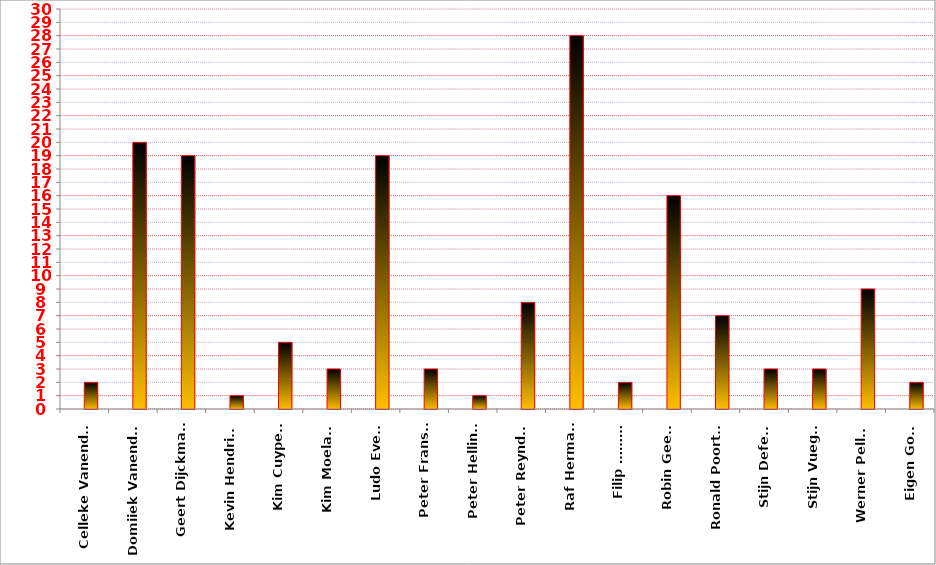
| Category | Series 0 | Series 1 |
|---|---|---|
| Celleke Vanendert |  | 2 |
| Domiiek Vanendert  |  | 20 |
| Geert Dijckmans |  | 19 |
| Kevin Hendrickx |  | 1 |
| Kim Cuypers |  | 5 |
| Kim Moelants |  | 3 |
| Ludo Evens |  | 19 |
| Peter Fransen |  | 3 |
| Peter Hellings |  | 1 |
| Peter Reynders |  | 8 |
| Raf Hermans |  | 28 |
| Filip ……… |  | 2 |
| Robin Geerts |  | 16 |
| Ronald Poorters |  | 7 |
| Stijn Deferm |  | 3 |
| Stijn Vuegen |  | 3 |
| Werner Pellens |  | 9 |
| Eigen Goals |  | 2 |